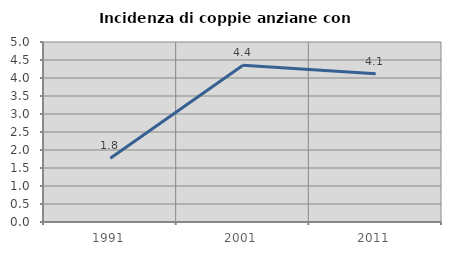
| Category | Incidenza di coppie anziane con figli |
|---|---|
| 1991.0 | 1.77 |
| 2001.0 | 4.356 |
| 2011.0 | 4.12 |